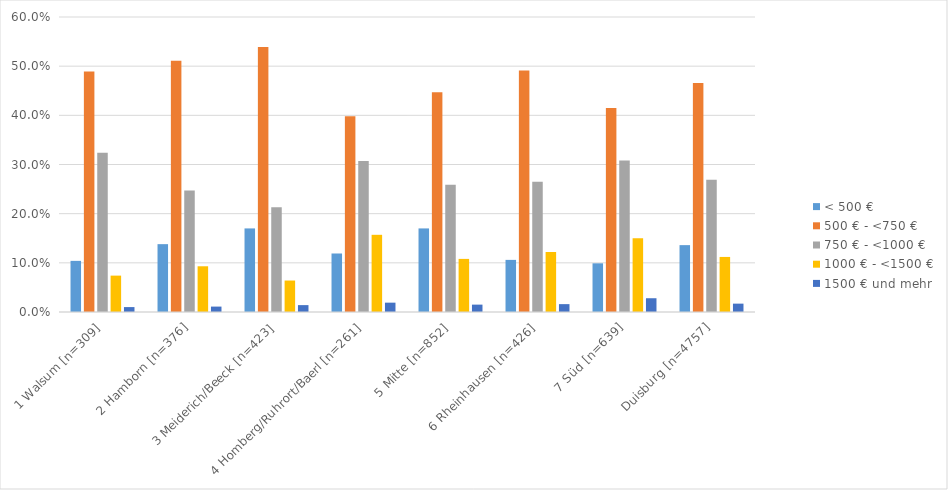
| Category | < 500 € | 500 € - <750 € | 750 € - <1000 € | 1000 € - <1500 € | 1500 € und mehr |
|---|---|---|---|---|---|
| 1 Walsum [n=309] | 0.104 | 0.489 | 0.324 | 0.074 | 0.01 |
| 2 Hamborn [n=376] | 0.138 | 0.511 | 0.247 | 0.093 | 0.011 |
| 3 Meiderich/Beeck [n=423] | 0.17 | 0.539 | 0.213 | 0.064 | 0.014 |
| 4 Homberg/Ruhrort/Baerl [n=261] | 0.119 | 0.398 | 0.307 | 0.157 | 0.019 |
| 5 Mitte [n=852] | 0.17 | 0.447 | 0.259 | 0.108 | 0.015 |
| 6 Rheinhausen [n=426] | 0.106 | 0.491 | 0.265 | 0.122 | 0.016 |
| 7 Süd [n=639] | 0.099 | 0.415 | 0.308 | 0.15 | 0.028 |
| Duisburg [n=4757] | 0.136 | 0.466 | 0.269 | 0.112 | 0.017 |